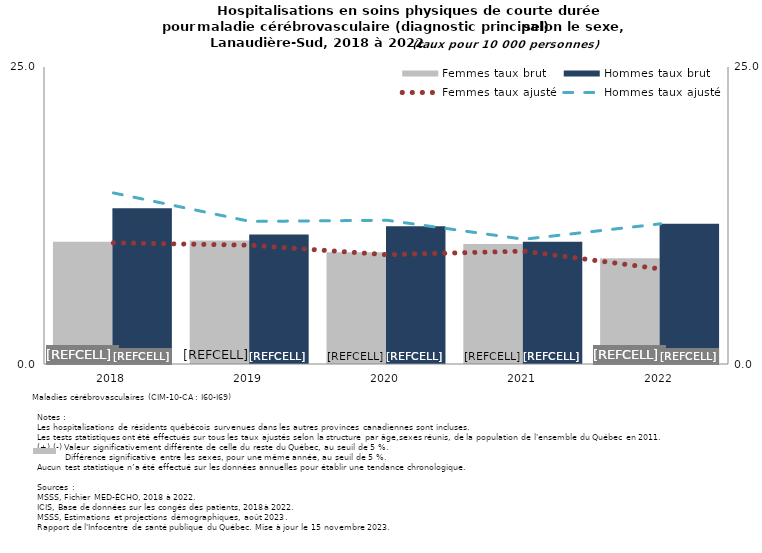
| Category | Femmes taux brut | Hommes taux brut |
|---|---|---|
| 2018.0 | 10.3 | 13.1 |
| 2019.0 | 10.4 | 10.9 |
| 2020.0 | 9.4 | 11.6 |
| 2021.0 | 10.1 | 10.3 |
| 2022.0 | 8.9 | 11.8 |